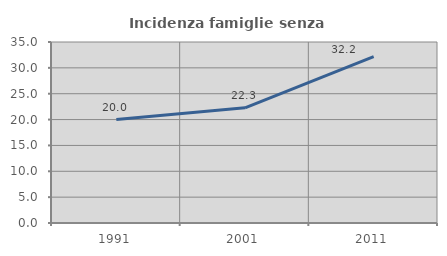
| Category | Incidenza famiglie senza nuclei |
|---|---|
| 1991.0 | 20.01 |
| 2001.0 | 22.273 |
| 2011.0 | 32.174 |